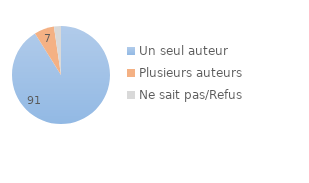
| Category | Series 0 |
|---|---|
| Un seul auteur | 91.1 |
| Plusieurs auteurs | 6.59 |
| Ne sait pas/Refus | 2.31 |